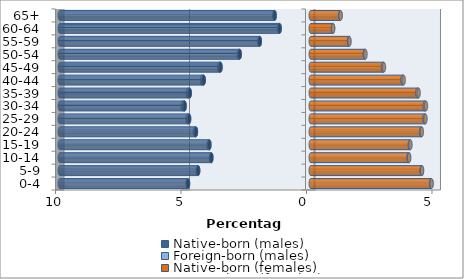
| Category | Native-born (males) | Foreign-born (males) | Native-born (females) | Foreign-born (females) |
|---|---|---|---|---|
| 0-4 | -4.89 | -0.012 | 4.802 | 0.013 |
| 5-9 | -4.486 | -0.014 | 4.421 | 0.015 |
| 10-14 | -3.959 | -0.017 | 3.904 | 0.018 |
| 15-19 | -4.038 | -0.028 | 3.949 | 0.023 |
| 20-24 | -4.575 | -0.041 | 4.393 | 0.032 |
| 25-29 | -4.847 | -0.06 | 4.535 | 0.036 |
| 30-34 | -5.026 | -0.076 | 4.545 | 0.046 |
| 35-39 | -4.82 | -0.078 | 4.251 | 0.046 |
| 40-44 | -4.265 | -0.068 | 3.658 | 0.045 |
| 45-49 | -3.596 | -0.051 | 2.881 | 0.036 |
| 50-54 | -2.83 | -0.032 | 2.154 | 0.025 |
| 55-59 | -2.03 | -0.017 | 1.527 | 0.014 |
| 60-64 | -1.24 | -0.009 | 0.887 | 0.004 |
| 65+ | -1.438 | -0.008 | 1.182 | 0.005 |